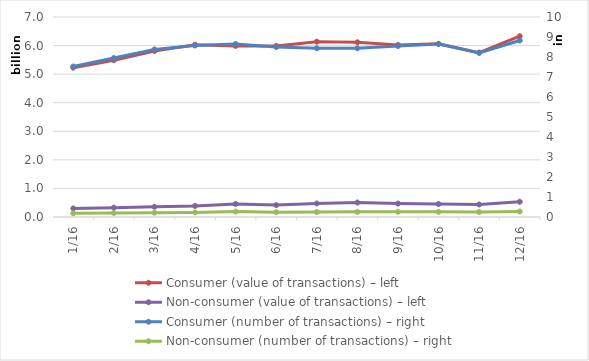
| Category | Consumer (value of transactions) – left | Non-consumer (value of transactions) – left |
|---|---|---|
| 2016-01-01 | 5226330848 | 300109813 |
| 2016-02-01 | 5488782511 | 327444350 |
| 2016-03-01 | 5811189705 | 358794842 |
| 2016-04-01 | 6031139999 | 388293108 |
| 2016-05-01 | 5987220696 | 456526784 |
| 2016-06-01 | 5987315978 | 416693872 |
| 2016-07-01 | 6136757826 | 474506012 |
| 2016-08-01 | 6114542171 | 506808994 |
| 2016-09-01 | 6021827645 | 469696807 |
| 2016-10-01 | 6061465844 | 454712788 |
| 2016-11-01 | 5754005870 | 438071124 |
| 2016-12-01 | 6327295262 | 533664906 |